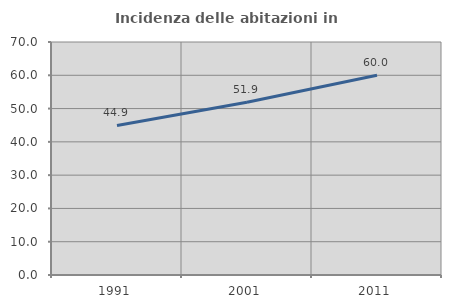
| Category | Incidenza delle abitazioni in proprietà  |
|---|---|
| 1991.0 | 44.928 |
| 2001.0 | 51.899 |
| 2011.0 | 60 |